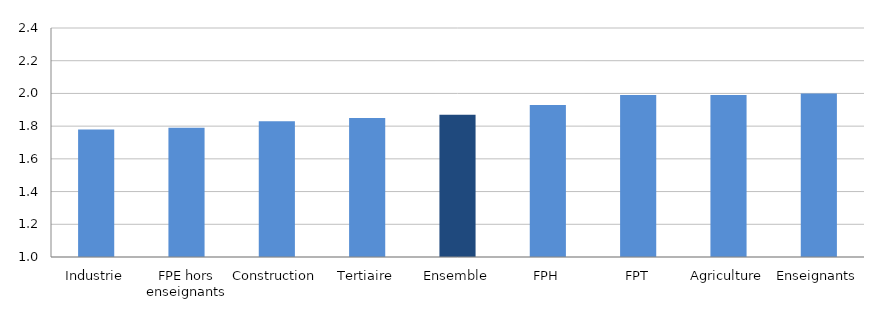
| Category | DF |
|---|---|
| Industrie | 1.78 |
| FPE hors enseignants | 1.79 |
| Construction | 1.83 |
| Tertiaire | 1.85 |
| Ensemble | 1.87 |
| FPH | 1.93 |
| FPT | 1.99 |
| Agriculture | 1.99 |
| Enseignants | 2 |